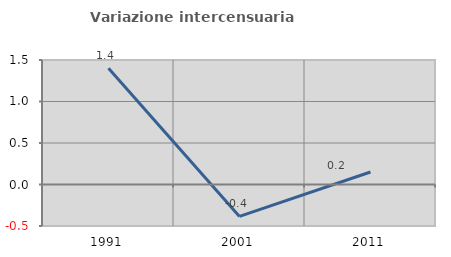
| Category | Variazione intercensuaria annua |
|---|---|
| 1991.0 | 1.402 |
| 2001.0 | -0.385 |
| 2011.0 | 0.15 |